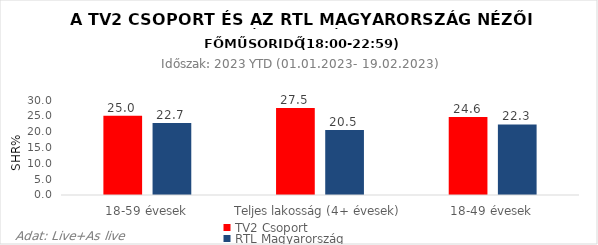
| Category | TV2 Csoport | RTL Magyarország |
|---|---|---|
| 18-59 évesek | 25 | 22.7 |
| Teljes lakosság (4+ évesek) | 27.5 | 20.5 |
| 18-49 évesek | 24.6 | 22.3 |